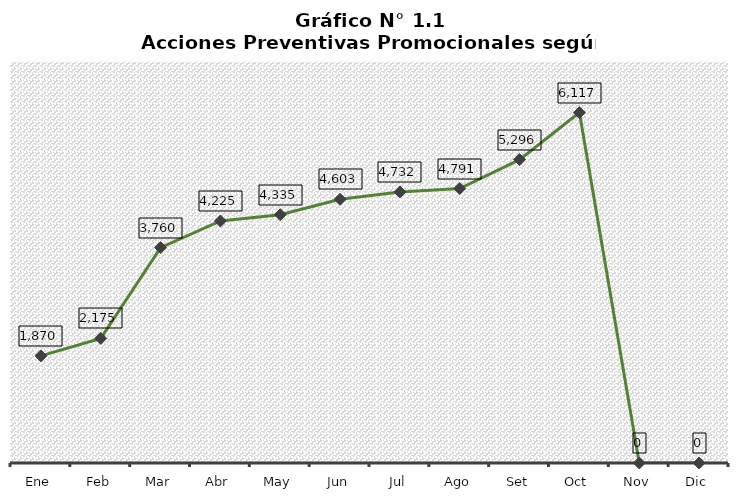
| Category | Series 0 |
|---|---|
| Ene | 1870 |
| Feb | 2175 |
| Mar | 3760 |
| Abr | 4225 |
| May | 4335 |
| Jun | 4603 |
| Jul | 4732 |
| Ago | 4791 |
| Set | 5296 |
| Oct | 6117 |
| Nov | 0 |
| Dic | 0 |